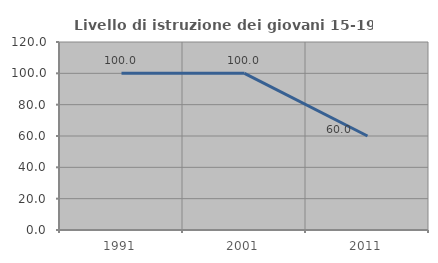
| Category | Livello di istruzione dei giovani 15-19 anni |
|---|---|
| 1991.0 | 100 |
| 2001.0 | 100 |
| 2011.0 | 60 |